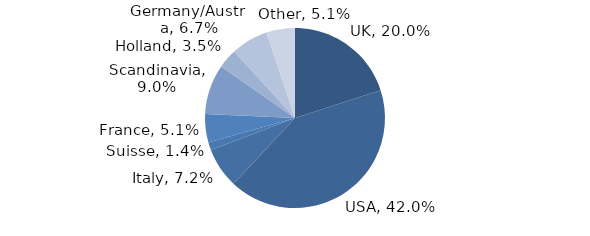
| Category | Investment Style |
|---|---|
| UK | 0.2 |
| USA | 0.42 |
| Italy | 0.072 |
| Suisse | 0.014 |
| France | 0.051 |
| Scandinavia | 0.09 |
| Holland | 0.035 |
| Germany/Austria | 0.067 |
| Other | 0.051 |